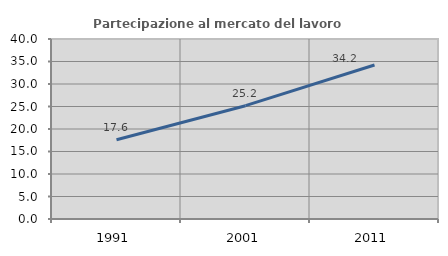
| Category | Partecipazione al mercato del lavoro  femminile |
|---|---|
| 1991.0 | 17.606 |
| 2001.0 | 25.18 |
| 2011.0 | 34.211 |